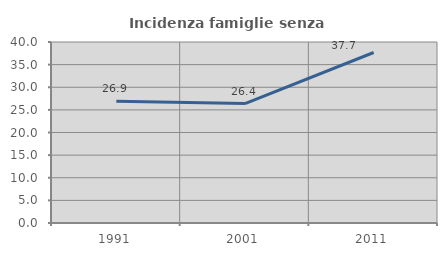
| Category | Incidenza famiglie senza nuclei |
|---|---|
| 1991.0 | 26.909 |
| 2001.0 | 26.394 |
| 2011.0 | 37.676 |